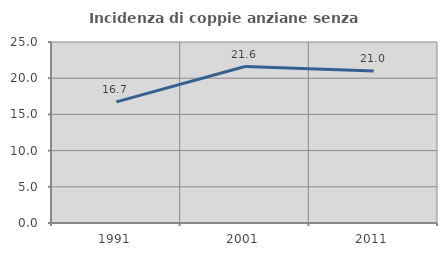
| Category | Incidenza di coppie anziane senza figli  |
|---|---|
| 1991.0 | 16.726 |
| 2001.0 | 21.612 |
| 2011.0 | 20.992 |